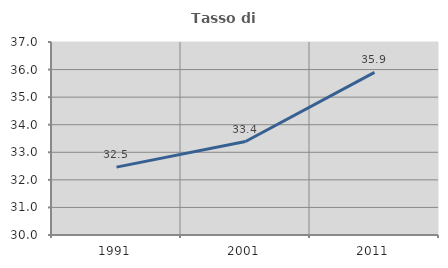
| Category | Tasso di occupazione   |
|---|---|
| 1991.0 | 32.462 |
| 2001.0 | 33.39 |
| 2011.0 | 35.9 |